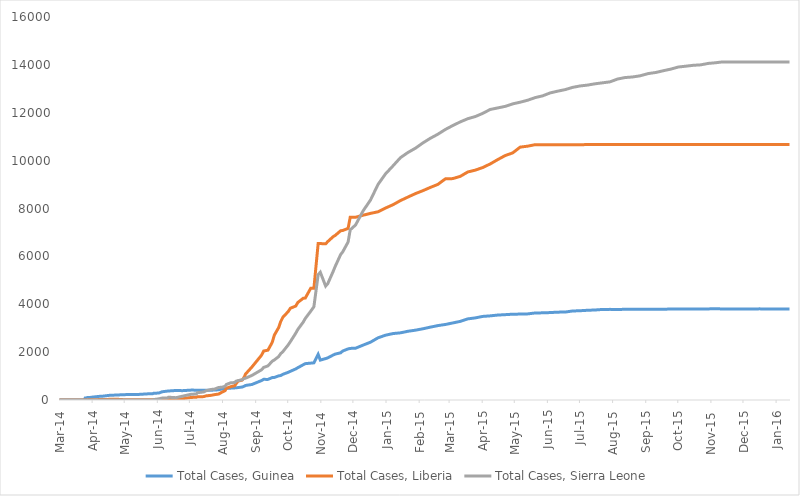
| Category | Total Cases, Guinea | Total Cases, Liberia | Total Cases, Sierra Leone |
|---|---|---|---|
| 2014-03-01 | 0 | 0 | 0 |
| 2014-03-02 | 0 | 0 | 0 |
| 2014-03-03 | 0 | 0 | 0 |
| 2014-03-04 | 0 | 0 | 0 |
| 2014-03-05 | 0 | 0 | 0 |
| 2014-03-06 | 0 | 0 | 0 |
| 2014-03-07 | 0 | 0 | 0 |
| 2014-03-08 | 0 | 0 | 0 |
| 2014-03-09 | 0 | 0 | 0 |
| 2014-03-10 | 0 | 0 | 0 |
| 2014-03-11 | 0 | 0 | 0 |
| 2014-03-12 | 0 | 0 | 0 |
| 2014-03-13 | 0 | 0 | 0 |
| 2014-03-14 | 0 | 0 | 0 |
| 2014-03-15 | 0 | 0 | 0 |
| 2014-03-16 | 0 | 0 | 0 |
| 2014-03-17 | 0 | 0 | 0 |
| 2014-03-18 | 0 | 0 | 0 |
| 2014-03-19 | 0 | 0 | 0 |
| 2014-03-20 | 0 | 0 | 0 |
| 2014-03-21 | 0 | 0 | 0 |
| 2014-03-22 | 0 | 0 | 0 |
| 2014-03-23 | 0 | 0 | 0 |
| 2014-03-24 | 0 | 0 | 0 |
| 2014-03-25 | 86 | 0 | 0 |
| 2014-03-26 | 86 | 0 | 0 |
| 2014-03-27 | 103 | 8 | 6 |
| 2014-03-31 | 112 | 8 | 0 |
| 2014-04-01 | 122 | 8 | 0 |
| 2014-04-02 | 127 | 8 | 0 |
| 2014-04-07 | 151 | 18 | 0 |
| 2014-04-10 | 157 | 22 | 0 |
| 2014-04-17 | 197 | 27 | 0 |
| 2014-04-21 | 203 | 27 | 0 |
| 2014-04-23 | 208 | 34 | 0 |
| 2014-04-30 | 221 | 13 | 0 |
| 2014-05-05 | 231 | 13 | 0 |
| 2014-05-14 | 233 | 12 | 0 |
| 2014-05-23 | 258 | 12 | 0 |
| 2014-05-27 | 258 | 12 | 1 |
| 2014-05-28 | 281 | 12 | 16 |
| 2014-06-02 | 291 | 13 | 50 |
| 2014-06-05 | 344 | 13 | 81 |
| 2014-06-10 | 372 | 15 | 89 |
| 2014-06-11 | 376 | 15 | 117 |
| 2014-06-18 | 398 | 33 | 97 |
| 2014-06-24 | 390 | 51 | 158 |
| 2014-07-02 | 413 | 107 | 239 |
| 2014-07-07 | 412 | 115 | 252 |
| 2014-07-08 | 408 | 131 | 305 |
| 2014-07-14 | 409 | 142 | 337 |
| 2014-07-16 | 406 | 172 | 386 |
| 2014-07-21 | 410 | 196 | 442 |
| 2014-07-24 | 415 | 224 | 454 |
| 2014-07-28 | 427 | 249 | 525 |
| 2014-07-31 | 460 | 329 | 533 |
| 2014-08-03 | 472 | 391 | 574 |
| 2014-08-04 | 485 | 486 | 646 |
| 2014-08-08 | 495 | 554 | 717 |
| 2014-08-12 | 506 | 599 | 730 |
| 2014-08-13 | 510 | 670 | 783 |
| 2014-08-15 | 519 | 786 | 810 |
| 2014-08-19 | 543 | 834 | 848 |
| 2014-08-21 | 579 | 972 | 907 |
| 2014-08-22 | 607 | 1082 | 910 |
| 2014-08-28 | 648 | 1378 | 1026 |
| 2014-09-06 | 812 | 1871 | 1261 |
| 2014-09-08 | 862 | 2046 | 1361 |
| 2014-09-12 | 861 | 2081 | 1424 |
| 2014-09-16 | 936 | 2407 | 1620 |
| 2014-09-18 | 942 | 2710 | 1673 |
| 2014-09-22 | 1008 | 3022 | 1813 |
| 2014-09-24 | 1022 | 3280 | 1940 |
| 2014-09-26 | 1074 | 3458 | 2021 |
| 2014-10-01 | 1157 | 3696 | 2304 |
| 2014-10-03 | 1199 | 3834 | 2437 |
| 2014-10-08 | 1298 | 3924 | 2789 |
| 2014-10-10 | 1350 | 4076 | 2950 |
| 2014-10-15 | 1472 | 4249 | 3252 |
| 2014-10-17 | 1519 | 4262 | 3410 |
| 2014-10-22 | 1540 | 4665 | 3706 |
| 2014-10-25 | 1553 | 4665 | 3896 |
| 2014-10-29 | 1906 | 6535 | 5235 |
| 2014-10-31 | 1667 | 6535 | 5338 |
| 2014-11-05 | 1731 | 6525 | 4759 |
| 2014-11-07 | 1760 | 6619 | 4862 |
| 2014-11-12 | 1878 | 6822 | 5368 |
| 2014-11-14 | 1919 | 6878 | 5586 |
| 2014-11-19 | 1971 | 7069 | 6073 |
| 2014-11-21 | 2047 | 7082 | 6190 |
| 2014-11-26 | 2134 | 7168 | 6599 |
| 2014-11-28 | 2155 | 7635 | 7109 |
| 2014-12-03 | 2164 | 7635 | 7312 |
| 2014-12-10 | 2292 | 7719 | 7897 |
| 2014-12-17 | 2416 | 7797 | 8356 |
| 2014-12-24 | 2597 | 7862 | 9004 |
| 2014-12-31 | 2707 | 8018 | 9446 |
| 2015-01-07 | 2775 | 8157 | 9780 |
| 2015-01-14 | 2806 | 8331 | 10124 |
| 2015-01-21 | 2871 | 8478 | 10340 |
| 2015-01-28 | 2917 | 8622 | 10518 |
| 2015-02-04 | 2975 | 8745 | 10740 |
| 2015-02-11 | 3044 | 8881 | 10934 |
| 2015-02-18 | 3108 | 9007 | 11103 |
| 2015-02-25 | 3155 | 9238 | 11301 |
| 2015-03-04 | 3219 | 9249 | 11466 |
| 2015-03-11 | 3285 | 9343 | 11619 |
| 2015-03-18 | 3389 | 9526 | 11751 |
| 2015-03-25 | 3429 | 9602 | 11841 |
| 2015-04-01 | 3492 | 9712 | 11974 |
| 2015-04-08 | 3515 | 9862 | 12138 |
| 2015-04-15 | 3548 | 10042 | 12201 |
| 2015-04-22 | 3565 | 10212 | 12267 |
| 2015-04-29 | 3584 | 10322 | 12371 |
| 2015-05-06 | 3589 | 10564 | 12440 |
| 2015-05-13 | 3597 | 10604 | 12523 |
| 2015-05-20 | 3635 | 10666 | 12632 |
| 2015-05-27 | 3641 | 10666 | 12706 |
| 2015-06-03 | 3652 | 10666 | 12827 |
| 2015-06-10 | 3670 | 10666 | 12901 |
| 2015-06-17 | 3674 | 10666 | 12965 |
| 2015-06-24 | 3718 | 10666 | 13059 |
| 2015-07-01 | 3729 | 10666 | 13119 |
| 2015-07-08 | 3748 | 10670 | 13155 |
| 2015-07-15 | 3760 | 10673 | 13209 |
| 2015-07-22 | 3783 | 10672 | 13250 |
| 2015-07-29 | 3786 | 10672 | 13290 |
| 2015-08-05 | 3784 | 10672 | 13406 |
| 2015-08-12 | 3787 | 10672 | 13470 |
| 2015-08-19 | 3786 | 10672 | 13494 |
| 2015-08-26 | 3792 | 10672 | 13541 |
| 2015-09-03 | 3792 | 10672 | 13638 |
| 2015-09-10 | 3792 | 10672 | 13683 |
| 2015-09-17 | 3792 | 10672 | 13756 |
| 2015-09-24 | 3800 | 10672 | 13823 |
| 2015-10-01 | 3805 | 10672 | 13911 |
| 2015-10-08 | 3804 | 10672 | 13945 |
| 2015-10-15 | 3800 | 10672 | 13982 |
| 2015-10-22 | 3803 | 10672 | 14001 |
| 2015-10-29 | 3806 | 10672 | 14061 |
| 2015-11-05 | 3810 | 10672 | 14089 |
| 2015-11-11 | 3805 | 10672 | 14122 |
| 2015-11-18 | 3804 | 10672 | 14122 |
| 2015-11-25 | 3804 | 10675 | 14122 |
| 2015-12-02 | 3804 | 10675 | 14122 |
| 2015-12-09 | 3804 | 10675 | 14122 |
| 2015-12-16 | 3807 | 10675 | 14122 |
| 2015-12-23 | 3804 | 10675 | 14122 |
| 2015-12-30 | 3804 | 10675 | 14122 |
| 2016-01-06 | 3804 | 10675 | 14122 |
| 2016-01-13 | 3804 | 10675 | 14122 |